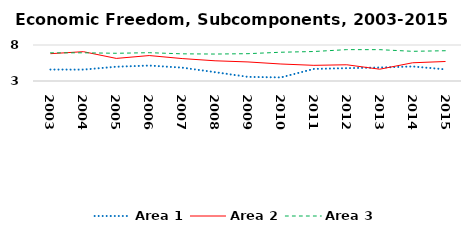
| Category | Area 1 | Area 2 | Area 3 |
|---|---|---|---|
| 2003.0 | 4.591 | 6.795 | 6.91 |
| 2004.0 | 4.584 | 7.072 | 6.917 |
| 2005.0 | 4.983 | 6.138 | 6.851 |
| 2006.0 | 5.146 | 6.534 | 6.931 |
| 2007.0 | 4.857 | 6.116 | 6.774 |
| 2008.0 | 4.225 | 5.807 | 6.744 |
| 2009.0 | 3.573 | 5.648 | 6.795 |
| 2010.0 | 3.498 | 5.36 | 6.995 |
| 2011.0 | 4.68 | 5.175 | 7.096 |
| 2012.0 | 4.784 | 5.253 | 7.356 |
| 2013.0 | 4.873 | 4.637 | 7.353 |
| 2014.0 | 5.02 | 5.532 | 7.123 |
| 2015.0 | 4.614 | 5.71 | 7.205 |